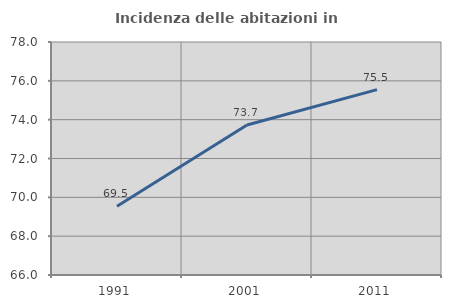
| Category | Incidenza delle abitazioni in proprietà  |
|---|---|
| 1991.0 | 69.544 |
| 2001.0 | 73.723 |
| 2011.0 | 75.549 |